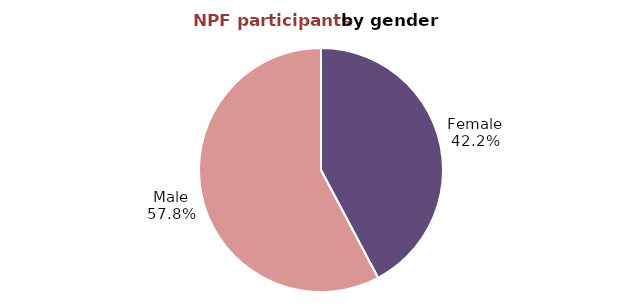
| Category | Series 0 |
|---|---|
| Female | 368062 |
| Male | 503141 |